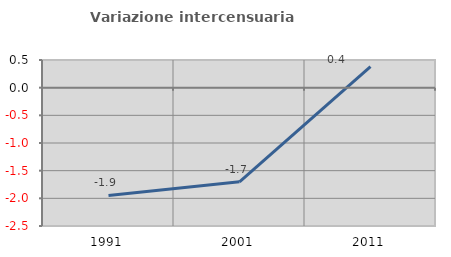
| Category | Variazione intercensuaria annua |
|---|---|
| 1991.0 | -1.948 |
| 2001.0 | -1.7 |
| 2011.0 | 0.381 |